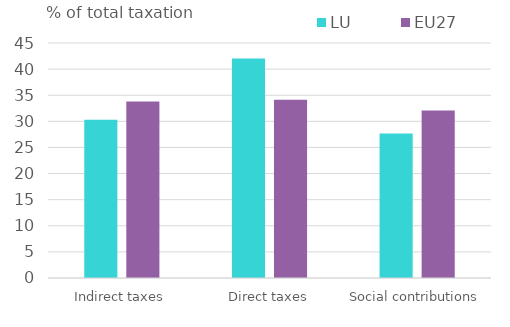
| Category | LU | EU27 |
|---|---|---|
| Indirect taxes | 30.304 | 33.811 |
| Direct taxes | 42.029 | 34.133 |
| Social contributions | 27.668 | 32.056 |